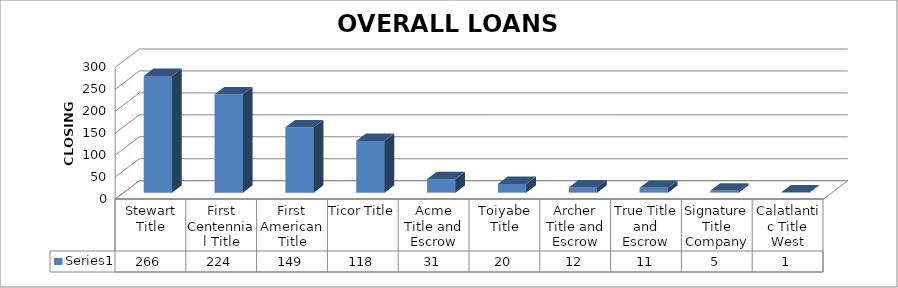
| Category | Series 0 |
|---|---|
| Stewart Title | 266 |
| First Centennial Title | 224 |
| First American Title | 149 |
| Ticor Title | 118 |
| Acme Title and Escrow | 31 |
| Toiyabe Title | 20 |
| Archer Title and Escrow | 12 |
| True Title and Escrow | 11 |
| Signature Title Company | 5 |
| Calatlantic Title West | 1 |